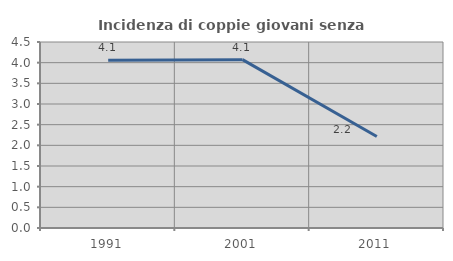
| Category | Incidenza di coppie giovani senza figli |
|---|---|
| 1991.0 | 4.057 |
| 2001.0 | 4.072 |
| 2011.0 | 2.215 |